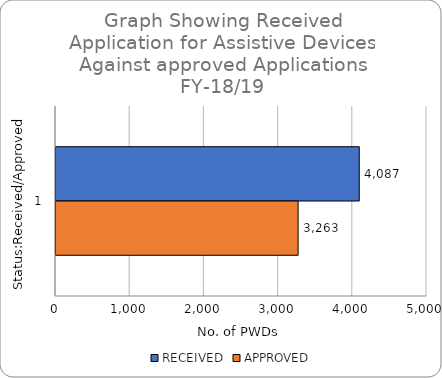
| Category | RECEIVED | APPROVED |
|---|---|---|
| 0 | 4087 | 3263 |